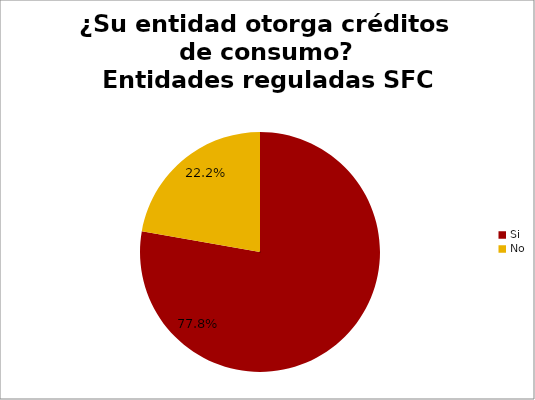
| Category | ¿Su entidad otorga créditos de consumo? Entidades reguladas SFC |
|---|---|
| Si | 0.778 |
| No | 0.222 |